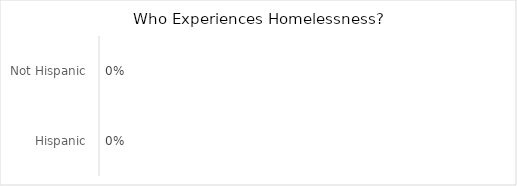
| Category | Series 0 |
|---|---|
| Hispanic | 0 |
| Not Hispanic | 0 |